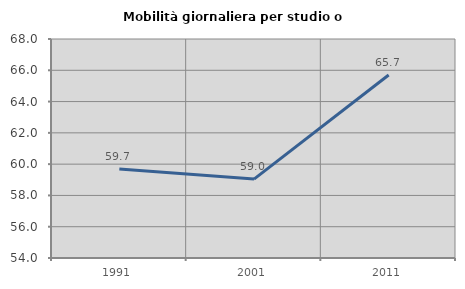
| Category | Mobilità giornaliera per studio o lavoro |
|---|---|
| 1991.0 | 59.696 |
| 2001.0 | 59.043 |
| 2011.0 | 65.7 |